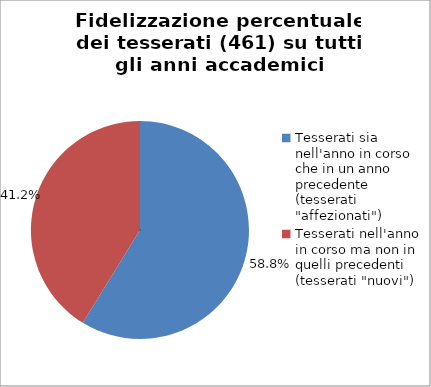
| Category | Nr. Tesserati |
|---|---|
| Tesserati sia nell'anno in corso che in un anno precedente (tesserati "affezionati") | 271 |
| Tesserati nell'anno in corso ma non in quelli precedenti (tesserati "nuovi") | 190 |